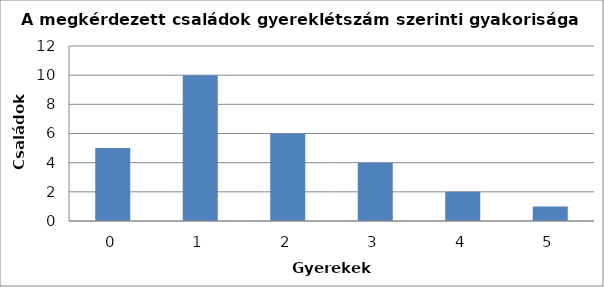
| Category | Series 0 |
|---|---|
| 0.0 | 5 |
| 1.0 | 10 |
| 2.0 | 6 |
| 3.0 | 4 |
| 4.0 | 2 |
| 5.0 | 1 |